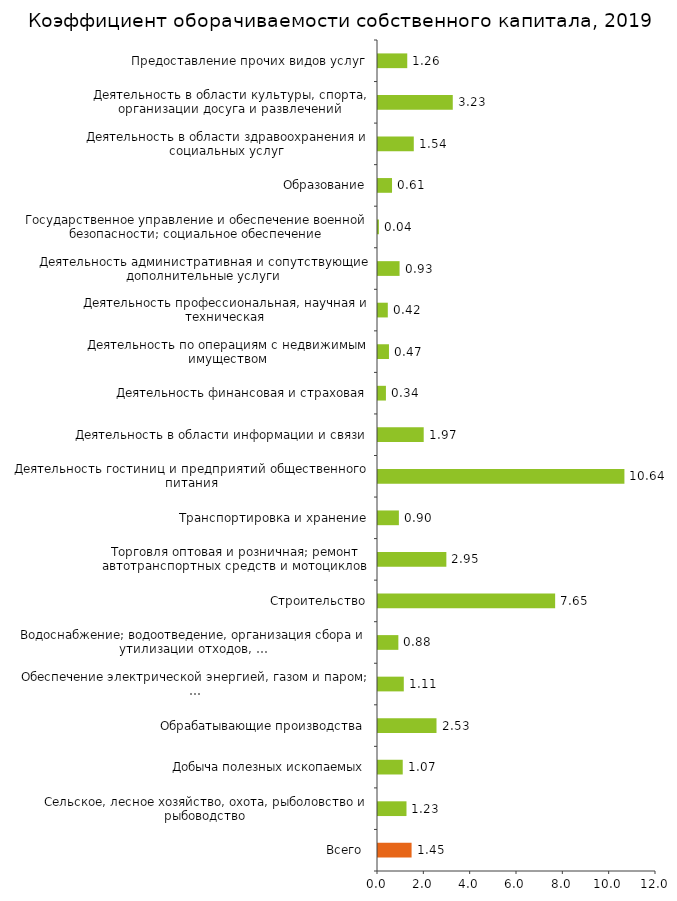
| Category | Series 0 |
|---|---|
| Всего  | 1.45 |
| Сельское, лесное хозяйство, охота, рыболовство и рыбоводство | 1.23 |
| Добыча полезных ископаемых | 1.068 |
| Обрабатывающие производства | 2.525 |
| Обеспечение электрической энергией, газом и паром; … | 1.114 |
| Водоснабжение; водоотведение, организация сбора и утилизации отходов, … | 0.879 |
| Строительство | 7.646 |
| Торговля оптовая и розничная; ремонт автотранспортных средств и мотоциклов | 2.951 |
| Транспортировка и хранение | 0.902 |
| Деятельность гостиниц и предприятий общественного питания | 10.637 |
| Деятельность в области информации и связи | 1.973 |
| Деятельность финансовая и страховая | 0.342 |
| Деятельность по операциям с недвижимым имуществом | 0.473 |
| Деятельность профессиональная, научная и техническая | 0.423 |
| Деятельность административная и сопутствующие дополнительные услуги | 0.931 |
| Государственное управление и обеспечение военной безопасности; социальное обеспечение | 0.039 |
| Образование | 0.606 |
| Деятельность в области здравоохранения и социальных услуг | 1.545 |
| Деятельность в области культуры, спорта, организации досуга и развлечений | 3.228 |
| Предоставление прочих видов услуг | 1.263 |